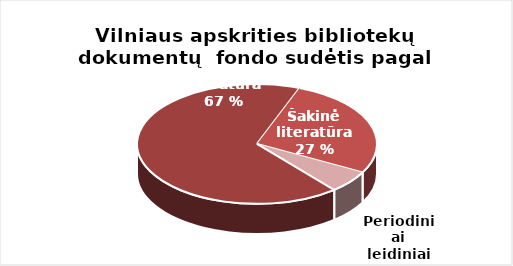
| Category | Series 0 |
|---|---|
| Grožinė literatūra* | 1065188 |
| Šakinė literatūra* | 431942 |
| period. | 95166 |